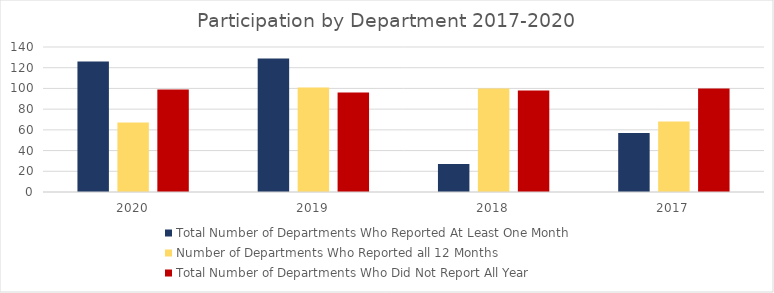
| Category | Total Number of Departments Who Reported At Least One Month | Number of Departments Who Reported all 12 Months | Total Number of Departments Who Did Not Report All Year |
|---|---|---|---|
| 2020.0 | 126 | 67 | 99 |
| 2019.0 | 129 | 101 | 96 |
| 2018.0 | 27 | 100 | 98 |
| 2017.0 | 57 | 68 | 100 |